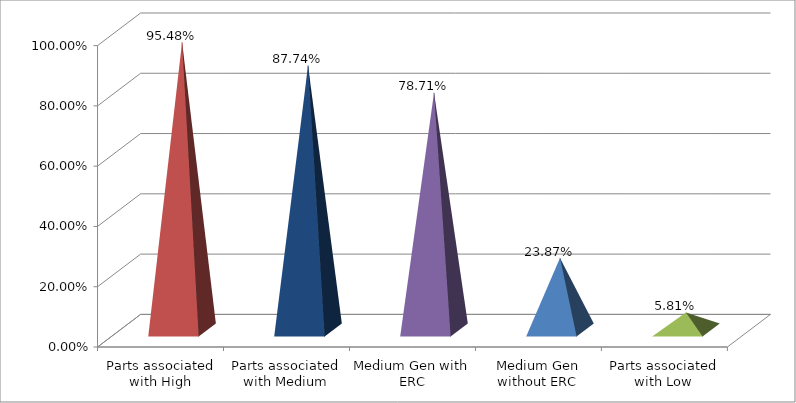
| Category | Series 0 |
|---|---|
| Parts associated with High | 0.955 |
| Parts associated with Medium | 0.877 |
| Medium Gen with ERC | 0.787 |
| Medium Gen without ERC | 0.239 |
| Parts associated with Low | 0.058 |